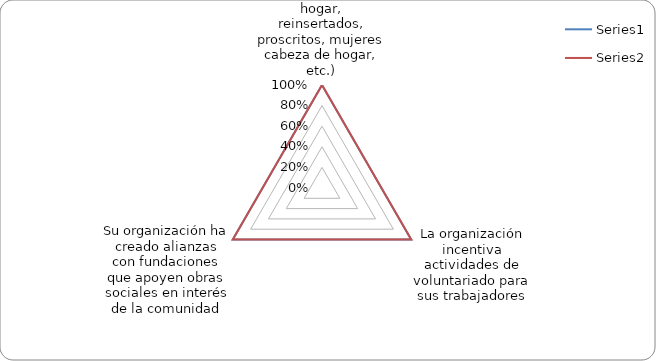
| Category | Series 0 | Series 1 |
|---|---|---|
| Su organización crea opciones de trabajo para población en situación de vulnerabilidad (desempleados, jóvenes en situación de riesgo, individuos sin hogar, reinsertados, proscritos, mujeres cabeza de hogar, etc.) | 1 | 1 |
| La organización incentiva actividades de voluntariado para sus trabajadores | 1 | 1 |
| Su organización ha creado alianzas con fundaciones que apoyen obras sociales en interés de la comunidad | 1 | 1 |